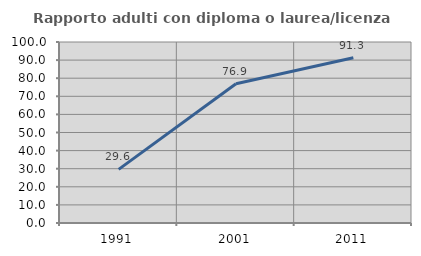
| Category | Rapporto adulti con diploma o laurea/licenza media  |
|---|---|
| 1991.0 | 29.63 |
| 2001.0 | 76.923 |
| 2011.0 | 91.304 |